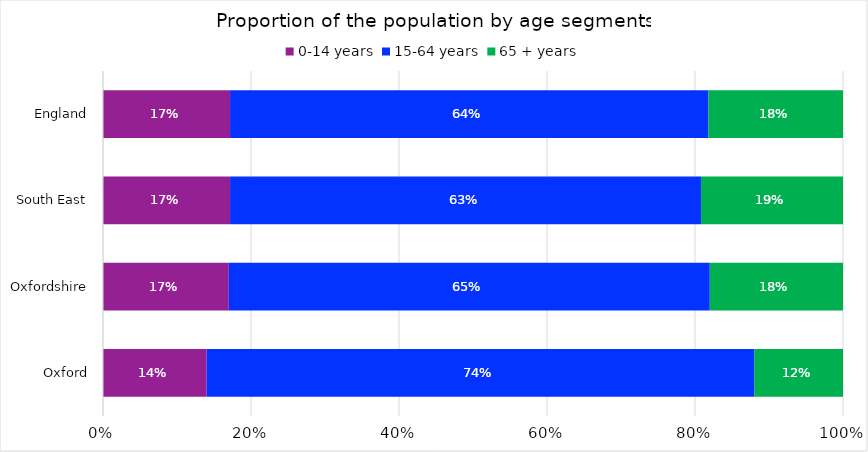
| Category | 0-14 years | 15-64 years | 65 + years |
|---|---|---|---|
| Oxford | 0.14 | 0.74 | 0.12 |
| Oxfordshire | 0.17 | 0.65 | 0.18 |
| South East | 0.17 | 0.63 | 0.19 |
| England | 0.17 | 0.64 | 0.18 |